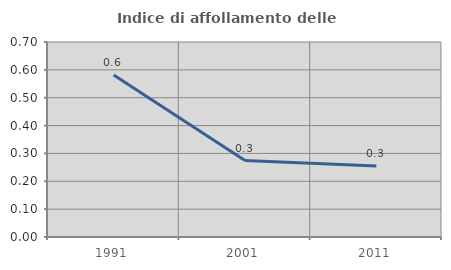
| Category | Indice di affollamento delle abitazioni  |
|---|---|
| 1991.0 | 0.581 |
| 2001.0 | 0.274 |
| 2011.0 | 0.255 |